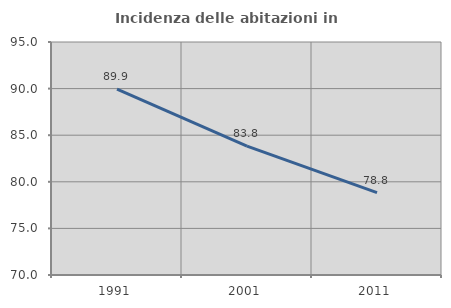
| Category | Incidenza delle abitazioni in proprietà  |
|---|---|
| 1991.0 | 89.95 |
| 2001.0 | 83.831 |
| 2011.0 | 78.846 |